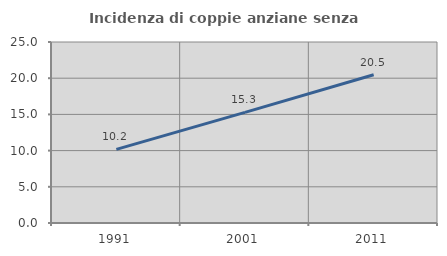
| Category | Incidenza di coppie anziane senza figli  |
|---|---|
| 1991.0 | 10.177 |
| 2001.0 | 15.273 |
| 2011.0 | 20.478 |